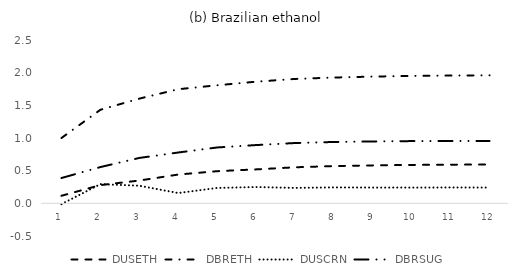
| Category | DUSETH | DBRETH | DUSCRN | DBRSUG |
|---|---|---|---|---|
| 0 | 0.116 | 1 | -0.012 | 0.387 |
| 1 | 0.279 | 1.432 | 0.294 | 0.555 |
| 2 | 0.349 | 1.603 | 0.269 | 0.695 |
| 3 | 0.44 | 1.746 | 0.158 | 0.778 |
| 4 | 0.492 | 1.807 | 0.235 | 0.855 |
| 5 | 0.52 | 1.862 | 0.25 | 0.892 |
| 6 | 0.552 | 1.904 | 0.236 | 0.923 |
| 7 | 0.57 | 1.925 | 0.244 | 0.939 |
| 8 | 0.581 | 1.94 | 0.241 | 0.948 |
| 9 | 0.588 | 1.95 | 0.241 | 0.953 |
| 10 | 0.592 | 1.956 | 0.243 | 0.954 |
| 11 | 0.594 | 1.959 | 0.241 | 0.955 |